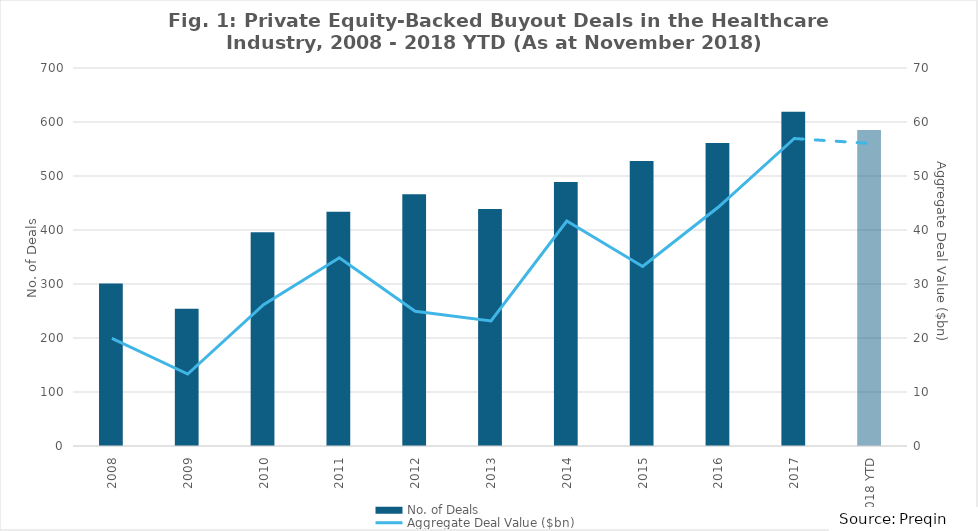
| Category | No. of Deals |
|---|---|
| 2008 | 301 |
| 2009 | 254 |
| 2010 | 396 |
| 2011 | 434 |
| 2012 | 466 |
| 2013 | 439 |
| 2014 | 489 |
| 2015 | 528 |
| 2016 | 561 |
| 2017 | 619 |
| 2018 YTD | 585 |